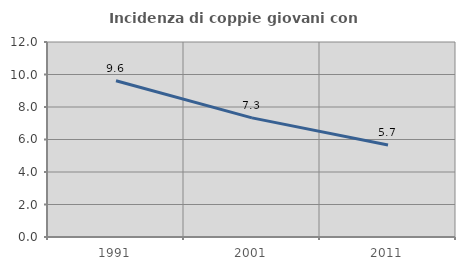
| Category | Incidenza di coppie giovani con figli |
|---|---|
| 1991.0 | 9.618 |
| 2001.0 | 7.331 |
| 2011.0 | 5.66 |